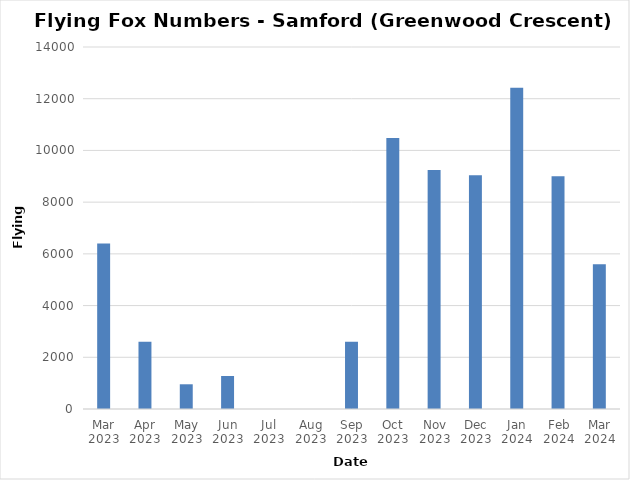
| Category | Flying-foxes |
|---|---|
| Mar 2023 | 6400 |
| Apr 2023 | 2600 |
| May 2023 | 956 |
| Jun 2023 | 1277 |
| Jul 2023 | 0 |
| Aug 2023 | 0 |
| Sep 2023 | 2604 |
| Oct 2023 | 10480 |
| Nov 2023 | 9240 |
| Dec 2023 | 9040 |
| Jan 2024 | 12426 |
| Feb 2024 | 9000 |
| Mar 2024 | 5600 |